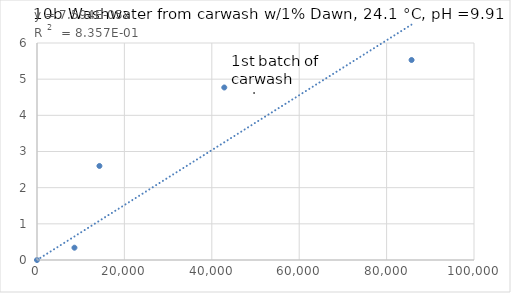
| Category | Series 0 |
|---|---|
| 0.0 | 0 |
| 8571.428571428572 | 0.34 |
| 14285.714285714286 | 2.6 |
| 42857.14285714286 | 4.77 |
| 85714.28571428572 | 5.53 |